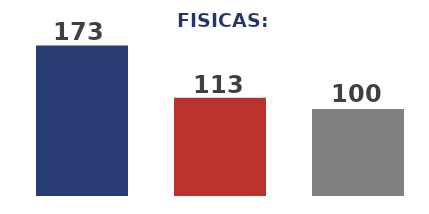
| Category | Series 0 |
|---|---|
| 0 | 173 |
| 1 | 113 |
| 2 | 100 |